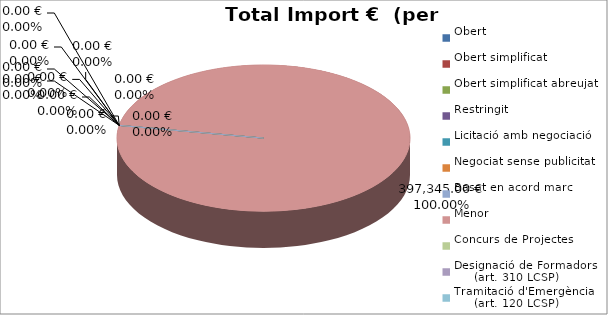
| Category | Total preu
(amb IVA) |
|---|---|
| Obert | 0 |
| Obert simplificat | 0 |
| Obert simplificat abreujat | 0 |
| Restringit | 0 |
| Licitació amb negociació | 0 |
| Negociat sense publicitat | 0 |
| Basat en acord marc | 0 |
| Menor | 397345 |
| Concurs de Projectes | 0 |
| Designació de Formadors
     (art. 310 LCSP) | 0 |
| Tramitació d'Emergència
     (art. 120 LCSP) | 0 |